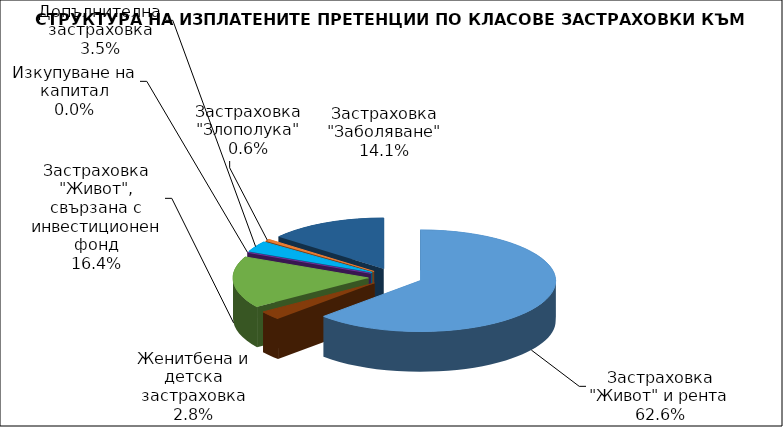
| Category | Застраховка "Живот" и рента |
|---|---|
| Застраховка "Живот" и рента | 56300617.036 |
| Женитбена и детска застраховка | 2480337.826 |
| Застраховка "Живот", свързана с инвестиционен фонд | 14762571.876 |
| Изкупуване на капитал | 0 |
| Допълнителна застраховка | 3108167.494 |
| Застраховка "Злополука" | 554212.613 |
| Застраховка "Заболяване" | 12711379.317 |